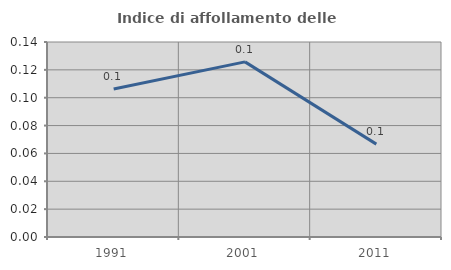
| Category | Indice di affollamento delle abitazioni  |
|---|---|
| 1991.0 | 0.106 |
| 2001.0 | 0.126 |
| 2011.0 | 0.067 |